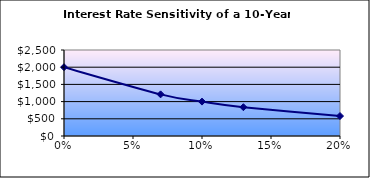
| Category | Series 0 |
|---|---|
| 0.0 | 2000 |
| 0.07 | 1210.707 |
| 0.1 | 1000 |
| 0.13 | 837.213 |
| 0.2 | 580.753 |